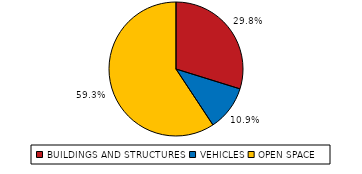
| Category | Series 0 |
|---|---|
| BUILDINGS AND STRUCTURES | 6028 |
| VEHICLES | 2208 |
| OPEN SPACE | 11996 |